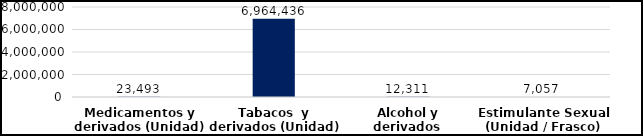
| Category | Series 0 |
|---|---|
| Medicamentos y derivados (Unidad) | 23493 |
| Tabacos  y derivados (Unidad) | 6964436 |
| Alcohol y derivados  (Botellas) | 12311 |
| Estimulante Sexual (Unidad / Frasco) | 7057 |